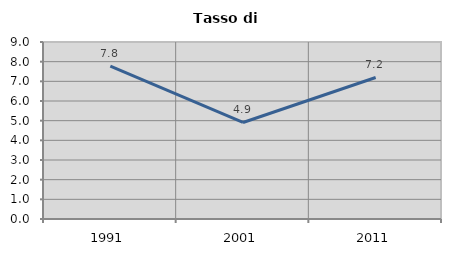
| Category | Tasso di disoccupazione   |
|---|---|
| 1991.0 | 7.778 |
| 2001.0 | 4.909 |
| 2011.0 | 7.196 |